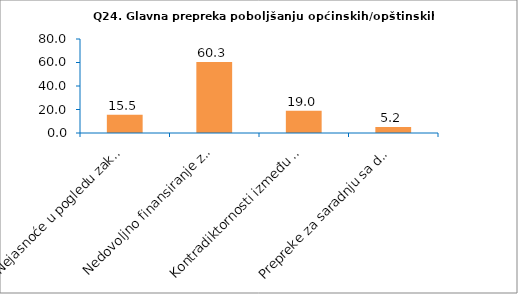
| Category | Series 0 |
|---|---|
| Nejasnoće u pogledu zakonskih odgovornosti | 15.517 |
| Nedovoljno finansiranje za zakonski dodijeljene nadležnosti | 60.345 |
| Kontradiktornosti između Zakona o principima lokalne samouprave i  sektorskih zakona | 18.966 |
| Prepreke za saradnju sa drugim jedinicama vlasti | 5.172 |